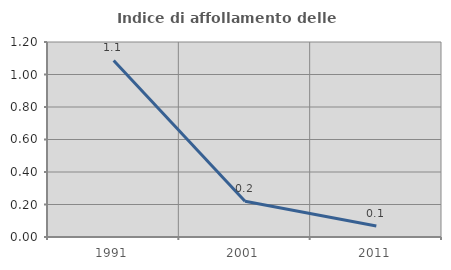
| Category | Indice di affollamento delle abitazioni  |
|---|---|
| 1991.0 | 1.086 |
| 2001.0 | 0.22 |
| 2011.0 | 0.068 |